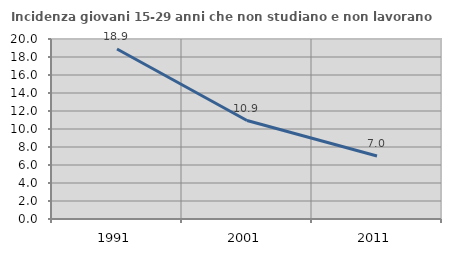
| Category | Incidenza giovani 15-29 anni che non studiano e non lavorano  |
|---|---|
| 1991.0 | 18.893 |
| 2001.0 | 10.942 |
| 2011.0 | 7.003 |